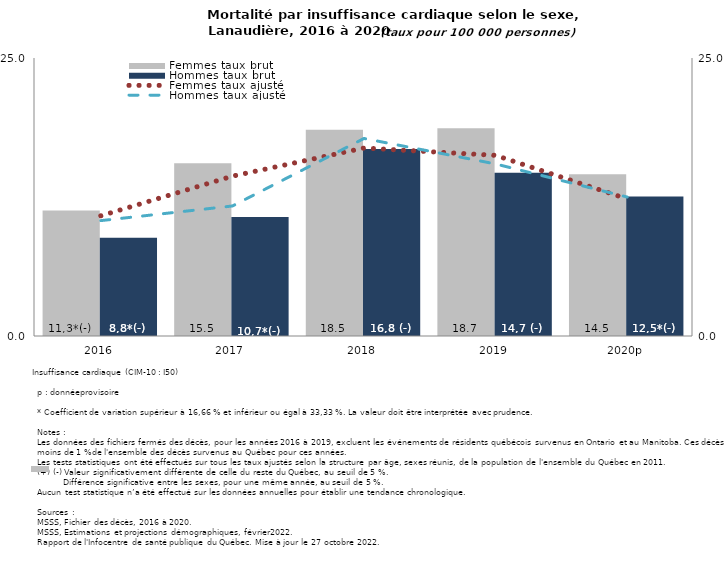
| Category | Femmes taux brut | Hommes taux brut |
|---|---|---|
| 2016 | 11.288 | 8.827 |
| 2017 | 15.542 | 10.712 |
| 2018 | 18.548 | 16.826 |
| 2019 | 18.683 | 14.682 |
| 2020p | 14.54 | 12.542 |